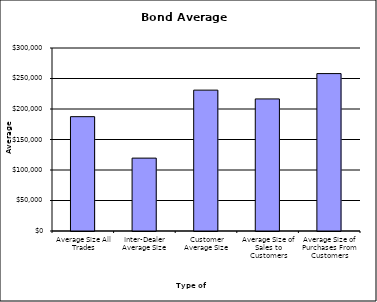
| Category | Security Type |
|---|---|
| Average Size All Trades | 187434.247 |
| Inter-Dealer Average Size | 119488.401 |
| Customer Average Size | 230941.432 |
| Average Size of Sales to Customers | 216503.326 |
| Average Size of Purchases From Customers | 258064.367 |